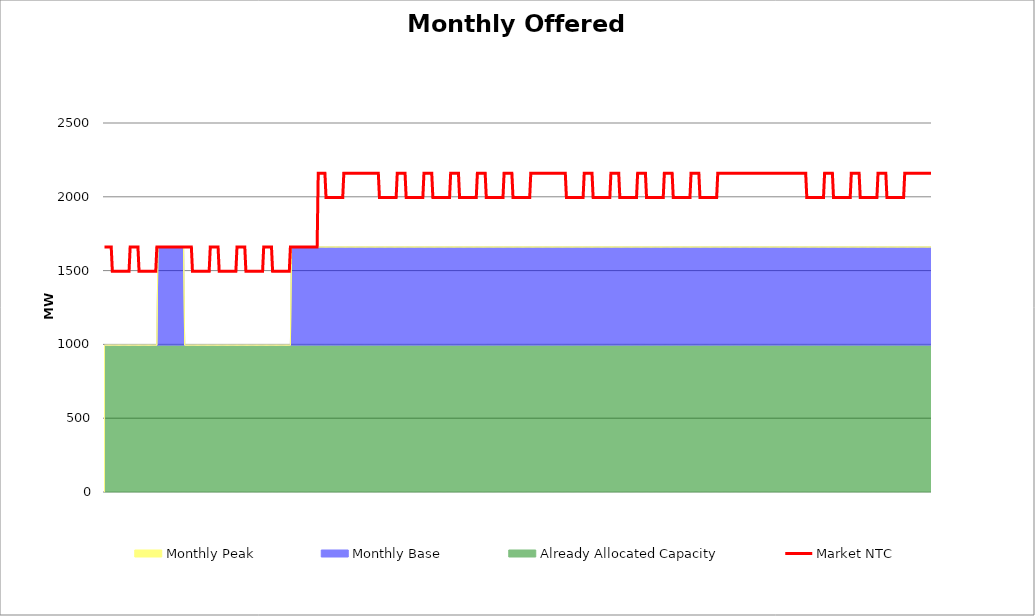
| Category | Market NTC |
|---|---|
| 0 | 1660 |
| 1 | 1660 |
| 2 | 1660 |
| 3 | 1660 |
| 4 | 1660 |
| 5 | 1660 |
| 6 | 1660 |
| 7 | 1495 |
| 8 | 1495 |
| 9 | 1495 |
| 10 | 1495 |
| 11 | 1495 |
| 12 | 1495 |
| 13 | 1495 |
| 14 | 1495 |
| 15 | 1495 |
| 16 | 1495 |
| 17 | 1495 |
| 18 | 1495 |
| 19 | 1495 |
| 20 | 1495 |
| 21 | 1495 |
| 22 | 1495 |
| 23 | 1660 |
| 24 | 1660 |
| 25 | 1660 |
| 26 | 1660 |
| 27 | 1660 |
| 28 | 1660 |
| 29 | 1660 |
| 30 | 1660 |
| 31 | 1495 |
| 32 | 1495 |
| 33 | 1495 |
| 34 | 1495 |
| 35 | 1495 |
| 36 | 1495 |
| 37 | 1495 |
| 38 | 1495 |
| 39 | 1495 |
| 40 | 1495 |
| 41 | 1495 |
| 42 | 1495 |
| 43 | 1495 |
| 44 | 1495 |
| 45 | 1495 |
| 46 | 1495 |
| 47 | 1660 |
| 48 | 1660 |
| 49 | 1660 |
| 50 | 1660 |
| 51 | 1660 |
| 52 | 1660 |
| 53 | 1660 |
| 54 | 1660 |
| 55 | 1660 |
| 56 | 1660 |
| 57 | 1660 |
| 58 | 1660 |
| 59 | 1660 |
| 60 | 1660 |
| 61 | 1660 |
| 62 | 1660 |
| 63 | 1660 |
| 64 | 1660 |
| 65 | 1660 |
| 66 | 1660 |
| 67 | 1660 |
| 68 | 1660 |
| 69 | 1660 |
| 70 | 1660 |
| 71 | 1660 |
| 72 | 1660 |
| 73 | 1660 |
| 74 | 1660 |
| 75 | 1660 |
| 76 | 1660 |
| 77 | 1660 |
| 78 | 1660 |
| 79 | 1495 |
| 80 | 1495 |
| 81 | 1495 |
| 82 | 1495 |
| 83 | 1495 |
| 84 | 1495 |
| 85 | 1495 |
| 86 | 1495 |
| 87 | 1495 |
| 88 | 1495 |
| 89 | 1495 |
| 90 | 1495 |
| 91 | 1495 |
| 92 | 1495 |
| 93 | 1495 |
| 94 | 1495 |
| 95 | 1660 |
| 96 | 1660 |
| 97 | 1660 |
| 98 | 1660 |
| 99 | 1660 |
| 100 | 1660 |
| 101 | 1660 |
| 102 | 1660 |
| 103 | 1495 |
| 104 | 1495 |
| 105 | 1495 |
| 106 | 1495 |
| 107 | 1495 |
| 108 | 1495 |
| 109 | 1495 |
| 110 | 1495 |
| 111 | 1495 |
| 112 | 1495 |
| 113 | 1495 |
| 114 | 1495 |
| 115 | 1495 |
| 116 | 1495 |
| 117 | 1495 |
| 118 | 1495 |
| 119 | 1660 |
| 120 | 1660 |
| 121 | 1660 |
| 122 | 1660 |
| 123 | 1660 |
| 124 | 1660 |
| 125 | 1660 |
| 126 | 1660 |
| 127 | 1495 |
| 128 | 1495 |
| 129 | 1495 |
| 130 | 1495 |
| 131 | 1495 |
| 132 | 1495 |
| 133 | 1495 |
| 134 | 1495 |
| 135 | 1495 |
| 136 | 1495 |
| 137 | 1495 |
| 138 | 1495 |
| 139 | 1495 |
| 140 | 1495 |
| 141 | 1495 |
| 142 | 1495 |
| 143 | 1660 |
| 144 | 1660 |
| 145 | 1660 |
| 146 | 1660 |
| 147 | 1660 |
| 148 | 1660 |
| 149 | 1660 |
| 150 | 1660 |
| 151 | 1495 |
| 152 | 1495 |
| 153 | 1495 |
| 154 | 1495 |
| 155 | 1495 |
| 156 | 1495 |
| 157 | 1495 |
| 158 | 1495 |
| 159 | 1495 |
| 160 | 1495 |
| 161 | 1495 |
| 162 | 1495 |
| 163 | 1495 |
| 164 | 1495 |
| 165 | 1495 |
| 166 | 1495 |
| 167 | 1660 |
| 168 | 1660 |
| 169 | 1660 |
| 170 | 1660 |
| 171 | 1660 |
| 172 | 1660 |
| 173 | 1660 |
| 174 | 1660 |
| 175 | 1660 |
| 176 | 1660 |
| 177 | 1660 |
| 178 | 1660 |
| 179 | 1660 |
| 180 | 1660 |
| 181 | 1660 |
| 182 | 1660 |
| 183 | 1660 |
| 184 | 1660 |
| 185 | 1660 |
| 186 | 1660 |
| 187 | 1660 |
| 188 | 1660 |
| 189 | 1660 |
| 190 | 1660 |
| 191 | 1660 |
| 192 | 2160 |
| 193 | 2160 |
| 194 | 2160 |
| 195 | 2160 |
| 196 | 2160 |
| 197 | 2160 |
| 198 | 2160 |
| 199 | 1995 |
| 200 | 1995 |
| 201 | 1995 |
| 202 | 1995 |
| 203 | 1995 |
| 204 | 1995 |
| 205 | 1995 |
| 206 | 1995 |
| 207 | 1995 |
| 208 | 1995 |
| 209 | 1995 |
| 210 | 1995 |
| 211 | 1995 |
| 212 | 1995 |
| 213 | 1995 |
| 214 | 1995 |
| 215 | 2160 |
| 216 | 2160 |
| 217 | 2160 |
| 218 | 2160 |
| 219 | 2160 |
| 220 | 2160 |
| 221 | 2160 |
| 222 | 2160 |
| 223 | 2160 |
| 224 | 2160 |
| 225 | 2160 |
| 226 | 2160 |
| 227 | 2160 |
| 228 | 2160 |
| 229 | 2160 |
| 230 | 2160 |
| 231 | 2160 |
| 232 | 2160 |
| 233 | 2160 |
| 234 | 2160 |
| 235 | 2160 |
| 236 | 2160 |
| 237 | 2160 |
| 238 | 2160 |
| 239 | 2160 |
| 240 | 2160 |
| 241 | 2160 |
| 242 | 2160 |
| 243 | 2160 |
| 244 | 2160 |
| 245 | 2160 |
| 246 | 2160 |
| 247 | 1995 |
| 248 | 1995 |
| 249 | 1995 |
| 250 | 1995 |
| 251 | 1995 |
| 252 | 1995 |
| 253 | 1995 |
| 254 | 1995 |
| 255 | 1995 |
| 256 | 1995 |
| 257 | 1995 |
| 258 | 1995 |
| 259 | 1995 |
| 260 | 1995 |
| 261 | 1995 |
| 262 | 1995 |
| 263 | 2160 |
| 264 | 2160 |
| 265 | 2160 |
| 266 | 2160 |
| 267 | 2160 |
| 268 | 2160 |
| 269 | 2160 |
| 270 | 2160 |
| 271 | 1995 |
| 272 | 1995 |
| 273 | 1995 |
| 274 | 1995 |
| 275 | 1995 |
| 276 | 1995 |
| 277 | 1995 |
| 278 | 1995 |
| 279 | 1995 |
| 280 | 1995 |
| 281 | 1995 |
| 282 | 1995 |
| 283 | 1995 |
| 284 | 1995 |
| 285 | 1995 |
| 286 | 1995 |
| 287 | 2160 |
| 288 | 2160 |
| 289 | 2160 |
| 290 | 2160 |
| 291 | 2160 |
| 292 | 2160 |
| 293 | 2160 |
| 294 | 2160 |
| 295 | 1995 |
| 296 | 1995 |
| 297 | 1995 |
| 298 | 1995 |
| 299 | 1995 |
| 300 | 1995 |
| 301 | 1995 |
| 302 | 1995 |
| 303 | 1995 |
| 304 | 1995 |
| 305 | 1995 |
| 306 | 1995 |
| 307 | 1995 |
| 308 | 1995 |
| 309 | 1995 |
| 310 | 1995 |
| 311 | 2160 |
| 312 | 2160 |
| 313 | 2160 |
| 314 | 2160 |
| 315 | 2160 |
| 316 | 2160 |
| 317 | 2160 |
| 318 | 2160 |
| 319 | 1995 |
| 320 | 1995 |
| 321 | 1995 |
| 322 | 1995 |
| 323 | 1995 |
| 324 | 1995 |
| 325 | 1995 |
| 326 | 1995 |
| 327 | 1995 |
| 328 | 1995 |
| 329 | 1995 |
| 330 | 1995 |
| 331 | 1995 |
| 332 | 1995 |
| 333 | 1995 |
| 334 | 1995 |
| 335 | 2160 |
| 336 | 2160 |
| 337 | 2160 |
| 338 | 2160 |
| 339 | 2160 |
| 340 | 2160 |
| 341 | 2160 |
| 342 | 2160 |
| 343 | 1995 |
| 344 | 1995 |
| 345 | 1995 |
| 346 | 1995 |
| 347 | 1995 |
| 348 | 1995 |
| 349 | 1995 |
| 350 | 1995 |
| 351 | 1995 |
| 352 | 1995 |
| 353 | 1995 |
| 354 | 1995 |
| 355 | 1995 |
| 356 | 1995 |
| 357 | 1995 |
| 358 | 1995 |
| 359 | 2160 |
| 360 | 2160 |
| 361 | 2160 |
| 362 | 2160 |
| 363 | 2160 |
| 364 | 2160 |
| 365 | 2160 |
| 366 | 2160 |
| 367 | 1995 |
| 368 | 1995 |
| 369 | 1995 |
| 370 | 1995 |
| 371 | 1995 |
| 372 | 1995 |
| 373 | 1995 |
| 374 | 1995 |
| 375 | 1995 |
| 376 | 1995 |
| 377 | 1995 |
| 378 | 1995 |
| 379 | 1995 |
| 380 | 1995 |
| 381 | 1995 |
| 382 | 1995 |
| 383 | 2160 |
| 384 | 2160 |
| 385 | 2160 |
| 386 | 2160 |
| 387 | 2160 |
| 388 | 2160 |
| 389 | 2160 |
| 390 | 2160 |
| 391 | 2160 |
| 392 | 2160 |
| 393 | 2160 |
| 394 | 2160 |
| 395 | 2160 |
| 396 | 2160 |
| 397 | 2160 |
| 398 | 2160 |
| 399 | 2160 |
| 400 | 2160 |
| 401 | 2160 |
| 402 | 2160 |
| 403 | 2160 |
| 404 | 2160 |
| 405 | 2160 |
| 406 | 2160 |
| 407 | 2160 |
| 408 | 2160 |
| 409 | 2160 |
| 410 | 2160 |
| 411 | 2160 |
| 412 | 2160 |
| 413 | 2160 |
| 414 | 2160 |
| 415 | 1995 |
| 416 | 1995 |
| 417 | 1995 |
| 418 | 1995 |
| 419 | 1995 |
| 420 | 1995 |
| 421 | 1995 |
| 422 | 1995 |
| 423 | 1995 |
| 424 | 1995 |
| 425 | 1995 |
| 426 | 1995 |
| 427 | 1995 |
| 428 | 1995 |
| 429 | 1995 |
| 430 | 1995 |
| 431 | 2160 |
| 432 | 2160 |
| 433 | 2160 |
| 434 | 2160 |
| 435 | 2160 |
| 436 | 2160 |
| 437 | 2160 |
| 438 | 2160 |
| 439 | 1995 |
| 440 | 1995 |
| 441 | 1995 |
| 442 | 1995 |
| 443 | 1995 |
| 444 | 1995 |
| 445 | 1995 |
| 446 | 1995 |
| 447 | 1995 |
| 448 | 1995 |
| 449 | 1995 |
| 450 | 1995 |
| 451 | 1995 |
| 452 | 1995 |
| 453 | 1995 |
| 454 | 1995 |
| 455 | 2160 |
| 456 | 2160 |
| 457 | 2160 |
| 458 | 2160 |
| 459 | 2160 |
| 460 | 2160 |
| 461 | 2160 |
| 462 | 2160 |
| 463 | 1995 |
| 464 | 1995 |
| 465 | 1995 |
| 466 | 1995 |
| 467 | 1995 |
| 468 | 1995 |
| 469 | 1995 |
| 470 | 1995 |
| 471 | 1995 |
| 472 | 1995 |
| 473 | 1995 |
| 474 | 1995 |
| 475 | 1995 |
| 476 | 1995 |
| 477 | 1995 |
| 478 | 1995 |
| 479 | 2160 |
| 480 | 2160 |
| 481 | 2160 |
| 482 | 2160 |
| 483 | 2160 |
| 484 | 2160 |
| 485 | 2160 |
| 486 | 2160 |
| 487 | 1995 |
| 488 | 1995 |
| 489 | 1995 |
| 490 | 1995 |
| 491 | 1995 |
| 492 | 1995 |
| 493 | 1995 |
| 494 | 1995 |
| 495 | 1995 |
| 496 | 1995 |
| 497 | 1995 |
| 498 | 1995 |
| 499 | 1995 |
| 500 | 1995 |
| 501 | 1995 |
| 502 | 1995 |
| 503 | 2160 |
| 504 | 2160 |
| 505 | 2160 |
| 506 | 2160 |
| 507 | 2160 |
| 508 | 2160 |
| 509 | 2160 |
| 510 | 2160 |
| 511 | 1995 |
| 512 | 1995 |
| 513 | 1995 |
| 514 | 1995 |
| 515 | 1995 |
| 516 | 1995 |
| 517 | 1995 |
| 518 | 1995 |
| 519 | 1995 |
| 520 | 1995 |
| 521 | 1995 |
| 522 | 1995 |
| 523 | 1995 |
| 524 | 1995 |
| 525 | 1995 |
| 526 | 1995 |
| 527 | 2160 |
| 528 | 2160 |
| 529 | 2160 |
| 530 | 2160 |
| 531 | 2160 |
| 532 | 2160 |
| 533 | 2160 |
| 534 | 2160 |
| 535 | 1995 |
| 536 | 1995 |
| 537 | 1995 |
| 538 | 1995 |
| 539 | 1995 |
| 540 | 1995 |
| 541 | 1995 |
| 542 | 1995 |
| 543 | 1995 |
| 544 | 1995 |
| 545 | 1995 |
| 546 | 1995 |
| 547 | 1995 |
| 548 | 1995 |
| 549 | 1995 |
| 550 | 1995 |
| 551 | 2160 |
| 552 | 2160 |
| 553 | 2160 |
| 554 | 2160 |
| 555 | 2160 |
| 556 | 2160 |
| 557 | 2160 |
| 558 | 2160 |
| 559 | 2160 |
| 560 | 2160 |
| 561 | 2160 |
| 562 | 2160 |
| 563 | 2160 |
| 564 | 2160 |
| 565 | 2160 |
| 566 | 2160 |
| 567 | 2160 |
| 568 | 2160 |
| 569 | 2160 |
| 570 | 2160 |
| 571 | 2160 |
| 572 | 2160 |
| 573 | 2160 |
| 574 | 2160 |
| 575 | 2160 |
| 576 | 2160 |
| 577 | 2160 |
| 578 | 2160 |
| 579 | 2160 |
| 580 | 2160 |
| 581 | 2160 |
| 582 | 2160 |
| 583 | 2160 |
| 584 | 2160 |
| 585 | 2160 |
| 586 | 2160 |
| 587 | 2160 |
| 588 | 2160 |
| 589 | 2160 |
| 590 | 2160 |
| 591 | 2160 |
| 592 | 2160 |
| 593 | 2160 |
| 594 | 2160 |
| 595 | 2160 |
| 596 | 2160 |
| 597 | 2160 |
| 598 | 2160 |
| 599 | 2160 |
| 600 | 2160 |
| 601 | 2160 |
| 602 | 2160 |
| 603 | 2160 |
| 604 | 2160 |
| 605 | 2160 |
| 606 | 2160 |
| 607 | 2160 |
| 608 | 2160 |
| 609 | 2160 |
| 610 | 2160 |
| 611 | 2160 |
| 612 | 2160 |
| 613 | 2160 |
| 614 | 2160 |
| 615 | 2160 |
| 616 | 2160 |
| 617 | 2160 |
| 618 | 2160 |
| 619 | 2160 |
| 620 | 2160 |
| 621 | 2160 |
| 622 | 2160 |
| 623 | 2160 |
| 624 | 2160 |
| 625 | 2160 |
| 626 | 2160 |
| 627 | 2160 |
| 628 | 2160 |
| 629 | 2160 |
| 630 | 2160 |
| 631 | 1995 |
| 632 | 1995 |
| 633 | 1995 |
| 634 | 1995 |
| 635 | 1995 |
| 636 | 1995 |
| 637 | 1995 |
| 638 | 1995 |
| 639 | 1995 |
| 640 | 1995 |
| 641 | 1995 |
| 642 | 1995 |
| 643 | 1995 |
| 644 | 1995 |
| 645 | 1995 |
| 646 | 1995 |
| 647 | 2160 |
| 648 | 2160 |
| 649 | 2160 |
| 650 | 2160 |
| 651 | 2160 |
| 652 | 2160 |
| 653 | 2160 |
| 654 | 2160 |
| 655 | 1995 |
| 656 | 1995 |
| 657 | 1995 |
| 658 | 1995 |
| 659 | 1995 |
| 660 | 1995 |
| 661 | 1995 |
| 662 | 1995 |
| 663 | 1995 |
| 664 | 1995 |
| 665 | 1995 |
| 666 | 1995 |
| 667 | 1995 |
| 668 | 1995 |
| 669 | 1995 |
| 670 | 1995 |
| 671 | 2160 |
| 672 | 2160 |
| 673 | 2160 |
| 674 | 2160 |
| 675 | 2160 |
| 676 | 2160 |
| 677 | 2160 |
| 678 | 2160 |
| 679 | 1995 |
| 680 | 1995 |
| 681 | 1995 |
| 682 | 1995 |
| 683 | 1995 |
| 684 | 1995 |
| 685 | 1995 |
| 686 | 1995 |
| 687 | 1995 |
| 688 | 1995 |
| 689 | 1995 |
| 690 | 1995 |
| 691 | 1995 |
| 692 | 1995 |
| 693 | 1995 |
| 694 | 1995 |
| 695 | 2160 |
| 696 | 2160 |
| 697 | 2160 |
| 698 | 2160 |
| 699 | 2160 |
| 700 | 2160 |
| 701 | 2160 |
| 702 | 2160 |
| 703 | 1995 |
| 704 | 1995 |
| 705 | 1995 |
| 706 | 1995 |
| 707 | 1995 |
| 708 | 1995 |
| 709 | 1995 |
| 710 | 1995 |
| 711 | 1995 |
| 712 | 1995 |
| 713 | 1995 |
| 714 | 1995 |
| 715 | 1995 |
| 716 | 1995 |
| 717 | 1995 |
| 718 | 1995 |
| 719 | 2160 |
| 720 | 2160 |
| 721 | 2160 |
| 722 | 2160 |
| 723 | 2160 |
| 724 | 2160 |
| 725 | 2160 |
| 726 | 2160 |
| 727 | 2160 |
| 728 | 2160 |
| 729 | 2160 |
| 730 | 2160 |
| 731 | 2160 |
| 732 | 2160 |
| 733 | 2160 |
| 734 | 2160 |
| 735 | 2160 |
| 736 | 2160 |
| 737 | 2160 |
| 738 | 2160 |
| 739 | 2160 |
| 740 | 2160 |
| 741 | 2160 |
| 742 | 2160 |
| 743 | 2160 |